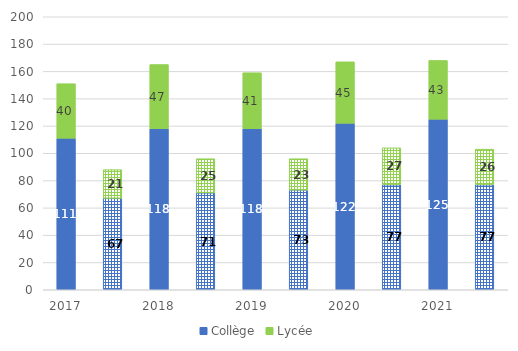
| Category | Collège | Lycée |
|---|---|---|
| 2017.0 | 111 | 40 |
| nan | 67 | 21 |
| 2018.0 | 118 | 47 |
| nan | 71 | 25 |
| 2019.0 | 118 | 41 |
| nan | 73 | 23 |
| 2020.0 | 122 | 45 |
| nan | 77 | 27 |
| 2021.0 | 125 | 43 |
| nan | 77 | 26 |